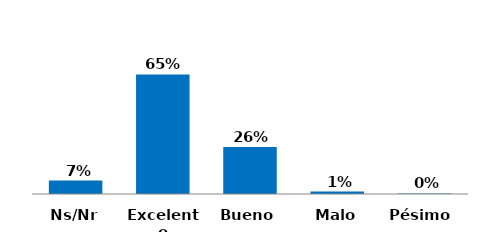
| Category | Series 0 |
|---|---|
| Pésimo  | 0.003 |
| Malo | 0.013 |
| Bueno | 0.257 |
| Excelente | 0.653 |
| Ns/Nr | 0.073 |